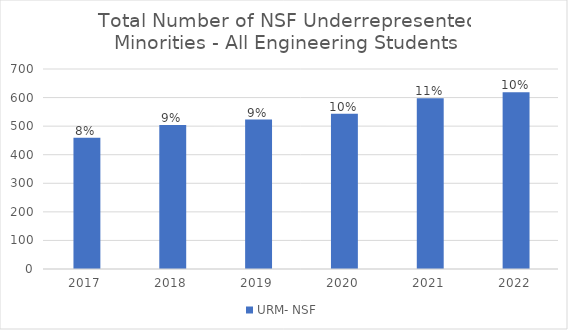
| Category | URM- NSF |
|---|---|
| 2017.0 | 459 |
| 2018.0 | 504 |
| 2019.0 | 523 |
| 2020.0 | 543 |
| 2021.0 | 598 |
| 2022.0 | 619 |